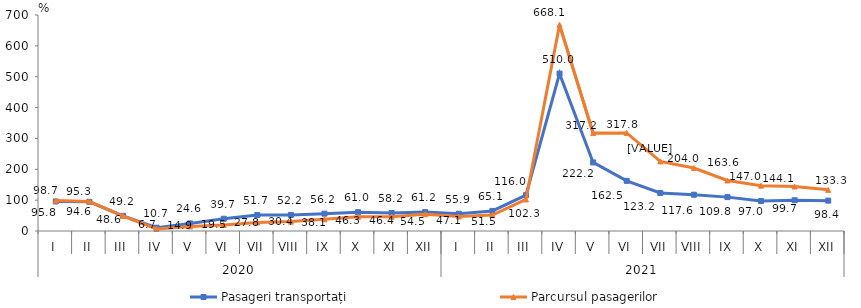
| Category | Pasageri transportați | Parcursul pasagerilor |
|---|---|---|
| 0 | 95.8 | 98.7 |
| 1 | 94.6 | 95.3 |
| 2 | 49.2 | 48.6 |
| 3 | 10.7 | 6.7 |
| 4 | 24.6 | 14.9 |
| 5 | 39.7 | 19.5 |
| 6 | 51.7 | 27.8 |
| 7 | 52.2 | 30.4 |
| 8 | 56.2 | 38.1 |
| 9 | 61 | 46.3 |
| 10 | 58.2 | 46.4 |
| 11 | 61.2 | 54.5 |
| 12 | 55.9 | 47.1 |
| 13 | 65.1 | 51.5 |
| 14 | 116 | 102.3 |
| 15 | 510 | 668.1 |
| 16 | 222.2 | 317.2 |
| 17 | 162.5 | 317.8 |
| 18 | 123.2 | 225.4 |
| 19 | 117.6 | 204 |
| 20 | 109.8 | 163.6 |
| 21 | 97 | 147 |
| 22 | 99.7 | 144.1 |
| 23 | 98.4 | 133.3 |